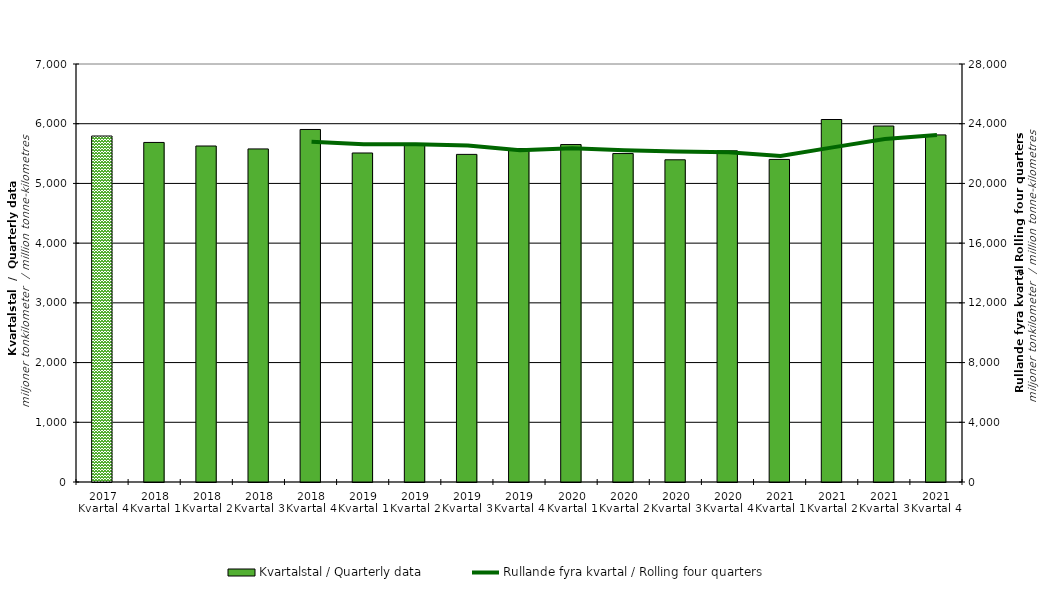
| Category | Kvartalstal / Quarterly data |
|---|---|
| 2017 Kvartal 4 | 5794.168 |
| 2018 Kvartal 1 | 5686.345 |
| 2018 Kvartal 2 | 5626.784 |
| 2018 Kvartal 3 | 5577.634 |
| 2018 Kvartal 4 | 5903.543 |
| 2019 Kvartal 1 | 5509.773 |
| 2019 Kvartal 2 | 5641.612 |
| 2019 Kvartal 3 | 5486.395 |
| 2019 Kvartal 4 | 5584.286 |
| 2020 Kvartal 1 | 5650.915 |
| 2020 Kvartal 2 | 5500.334 |
| 2020 Kvartal 3 | 5395.987 |
| 2020 Kvartal 4 | 5546.662 |
| 2021 Kvartal 1 | 5401.907 |
| 2021 Kvartal 2 | 6070.369 |
| 2021 Kvartal 3 | 5961.468 |
| 2021 Kvartal 4 | 5812.669 |